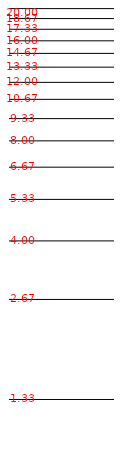
| Category | Series 0 |
|---|---|
| 0.0 | 0.288 |
| 0.0 | 0.981 |
| 0.0 | 1.386 |
| 0.0 | 1.674 |
| 0.0 | 1.897 |
| 0.0 | 2.079 |
| 0.0 | 2.234 |
| 0.0 | 2.367 |
| 0.0 | 2.485 |
| 0.0 | 2.59 |
| 0.0 | 2.686 |
| 0.0 | 2.773 |
| 0.0 | 2.853 |
| 0.0 | 2.927 |
| 0.0 | 2.996 |
| 0.0 | 3.06 |
| 0.0 | 3.121 |
| 0.0 | 3.178 |
| 0.0 | 3.232 |
| 0.0 | 3.283 |
| 0.0 | 3.332 |
| 0.0 | 3.379 |
| 0.0 | 3.423 |
| 0.0 | 3.466 |
| 0.0 | 3.507 |
| 0.0 | 3.546 |
| 0.0 | 3.583 |